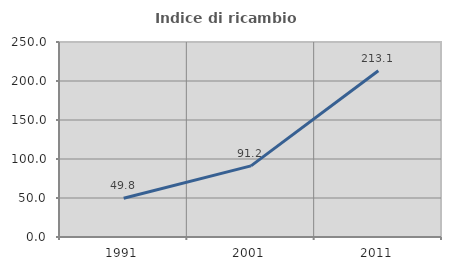
| Category | Indice di ricambio occupazionale  |
|---|---|
| 1991.0 | 49.772 |
| 2001.0 | 91.189 |
| 2011.0 | 213.077 |